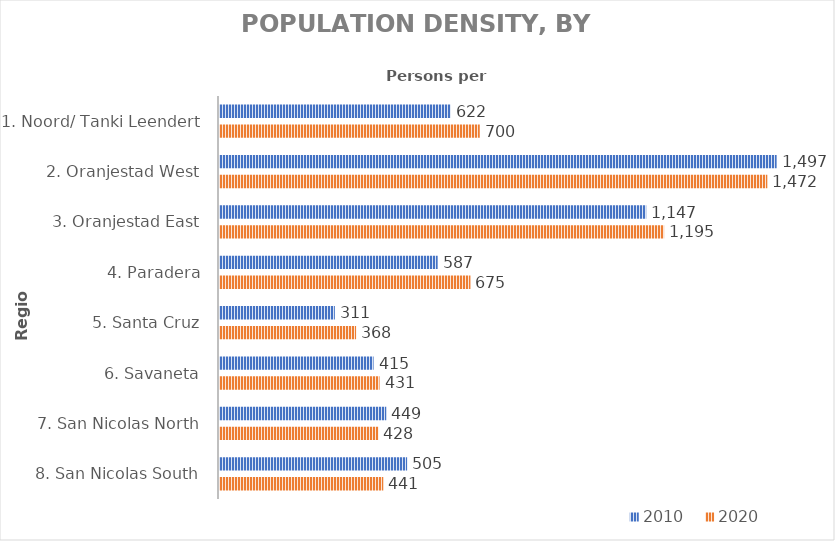
| Category | 2010 | 2020 |
|---|---|---|
| 1. Noord/ Tanki Leendert | 622 | 700 |
| 2. Oranjestad West | 1497 | 1472 |
| 3. Oranjestad East | 1147 | 1195 |
| 4. Paradera | 587 | 675 |
| 5. Santa Cruz | 311 | 368 |
| 6. Savaneta | 415 | 431 |
| 7. San Nicolas North | 449 | 428 |
| 8. San Nicolas South | 505 | 441 |